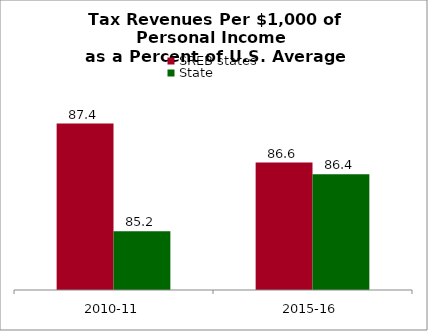
| Category | SREB states | State |
|---|---|---|
| 2010-11 | 87.433 | 85.211 |
| 2015-16 | 86.629 | 86.384 |